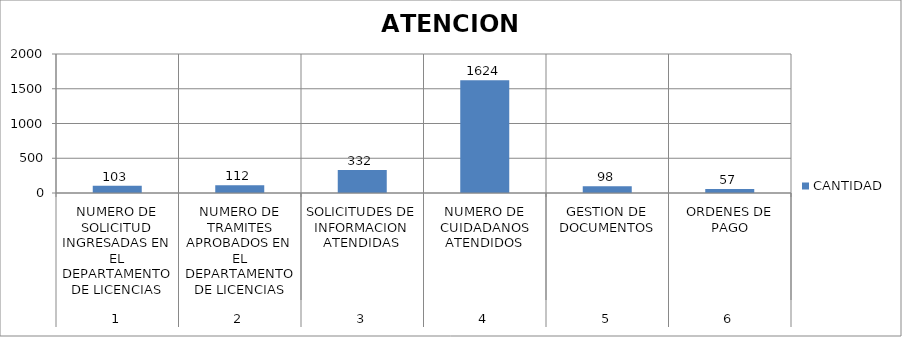
| Category | CANTIDAD |
|---|---|
| 0 | 103 |
| 1 | 112 |
| 2 | 332 |
| 3 | 1624 |
| 4 | 98 |
| 5 | 57 |